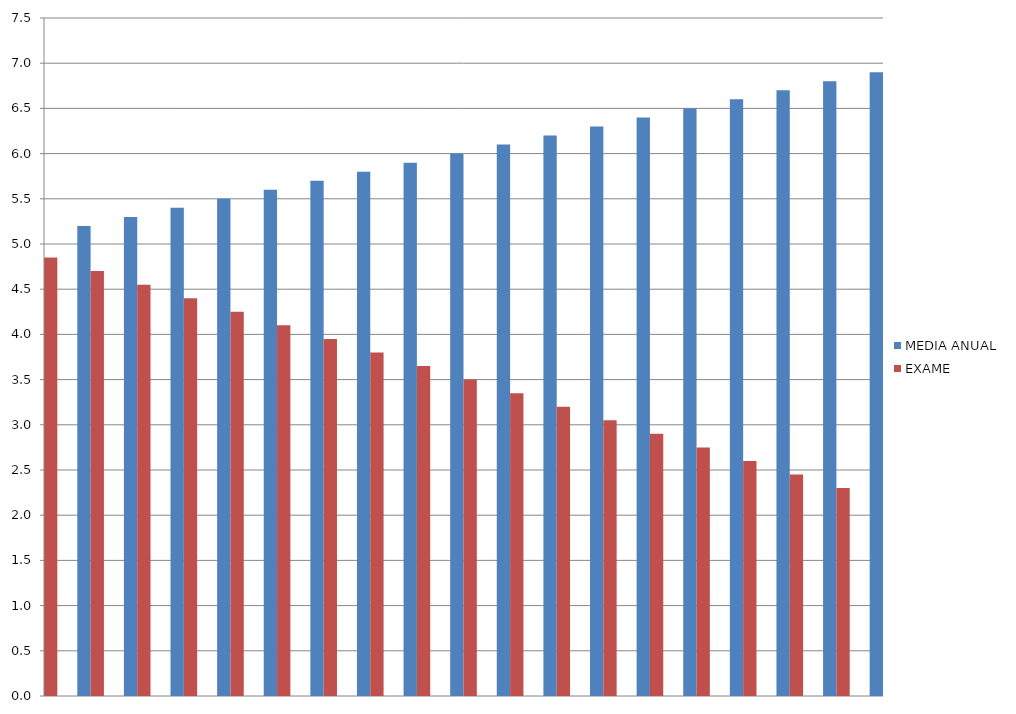
| Category | MEDIA ANUAL | EXAME |
|---|---|---|
| 0 | 5.1 | 4.85 |
| 1 | 5.2 | 4.7 |
| 2 | 5.3 | 4.55 |
| 3 | 5.4 | 4.4 |
| 4 | 5.5 | 4.25 |
| 5 | 5.6 | 4.1 |
| 6 | 5.7 | 3.95 |
| 7 | 5.8 | 3.8 |
| 8 | 5.9 | 3.65 |
| 9 | 6 | 3.5 |
| 10 | 6.1 | 3.35 |
| 11 | 6.2 | 3.2 |
| 12 | 6.3 | 3.05 |
| 13 | 6.4 | 2.9 |
| 14 | 6.5 | 2.75 |
| 15 | 6.6 | 2.6 |
| 16 | 6.7 | 2.45 |
| 17 | 6.8 | 2.3 |
| 18 | 6.9 | 2.15 |